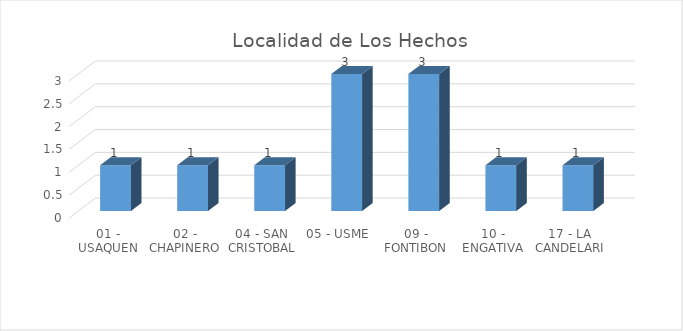
| Category | Total |
|---|---|
| 01 - USAQUEN | 1 |
| 02 - CHAPINERO | 1 |
| 04 - SAN CRISTOBAL | 1 |
| 05 - USME | 3 |
| 09 - FONTIBON | 3 |
| 10 - ENGATIVA | 1 |
| 17 - LA CANDELARIA | 1 |